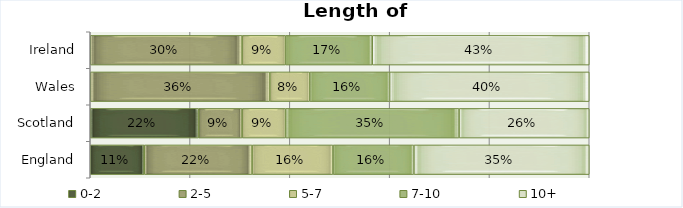
| Category | 0-2 | 2-5 | 5-7 | 7-10 | 10+ |
|---|---|---|---|---|---|
| England | 0.108 | 0.216 | 0.162 | 0.162 | 0.351 |
| Scotland | 0.217 | 0.087 | 0.087 | 0.348 | 0.261 |
| Wales | 0 | 0.36 | 0.08 | 0.16 | 0.4 |
| Ireland | 0 | 0.304 | 0.087 | 0.174 | 0.435 |